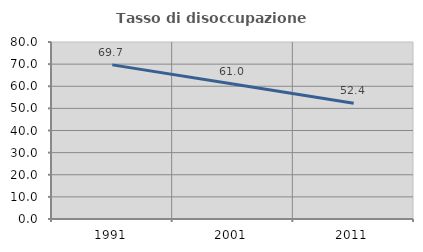
| Category | Tasso di disoccupazione giovanile  |
|---|---|
| 1991.0 | 69.656 |
| 2001.0 | 61.011 |
| 2011.0 | 52.358 |